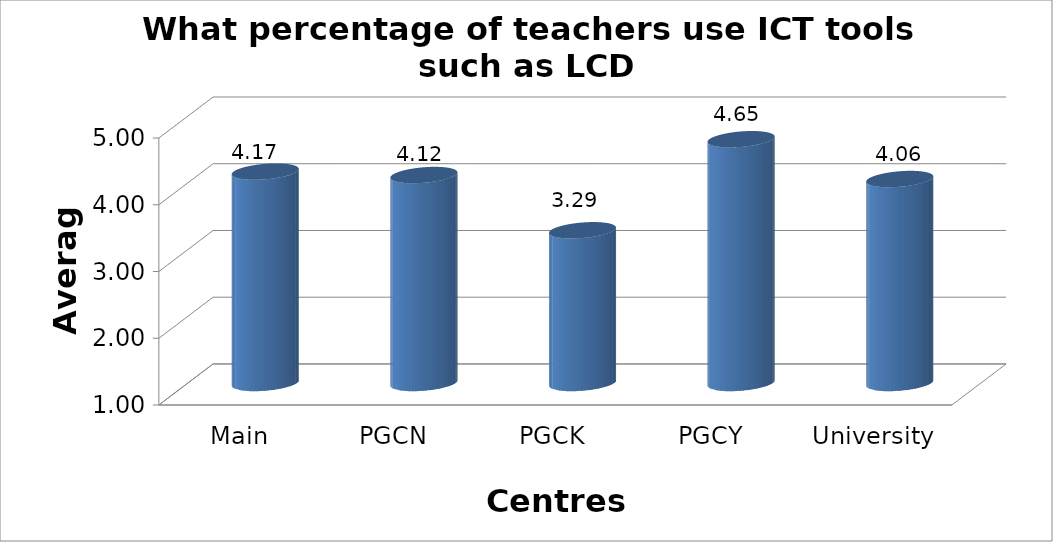
| Category | What percentage of teachers use ICT tools such as LCD projector,Multimedia,etc.while teaching, |
|---|---|
| Main Campus | 4.168 |
| PGCN | 4.116 |
| PGCK | 3.289 |
| PGCY | 4.653 |
| University Avg | 4.056 |